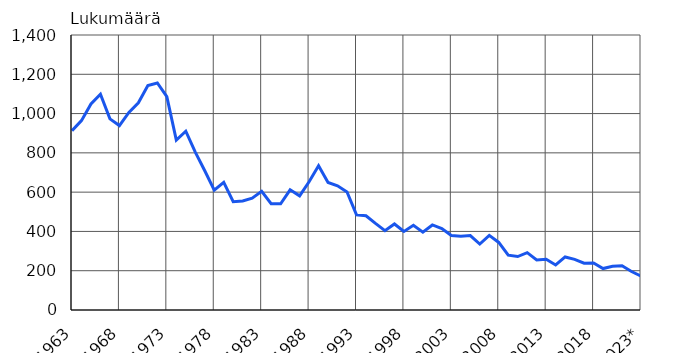
| Category | Tieliikenneonnettomuuksissa kuolleet |
|---|---|
| 1963 | 913 |
| 1964 | 964 |
| 1965 | 1049 |
| 1966 | 1098 |
| 1967 | 973 |
| 1968 | 939 |
| 1969 | 1006 |
| 1970 | 1055 |
| 1971 | 1143 |
| 1972 | 1156 |
| 1973 | 1086 |
| 1974 | 865 |
| 1975 | 910 |
| 1976 | 804 |
| 1977 | 709 |
| 1978 | 610 |
| 1979 | 650 |
| 1980 | 551 |
| 1981 | 555 |
| 1982 | 569 |
| 1983 | 604 |
| 1984 | 541 |
| 1985 | 541 |
| 1986 | 612 |
| 1987 | 581 |
| 1988 | 653 |
| 1989 | 734 |
| 1990 | 649 |
| 1991 | 632 |
| 1992 | 601 |
| 1993 | 484 |
| 1994 | 480 |
| 1995 | 441 |
| 1996 | 404 |
| 1997 | 438 |
| 1998 | 400 |
| 1999 | 431 |
| 2000 | 396 |
| 2001 | 433 |
| 2002 | 415 |
| 2003 | 379 |
| 2004 | 375 |
| 2005 | 379 |
| 2006 | 336 |
| 2007 | 380 |
| 2008 | 344 |
| 2009 | 279 |
| 2010 | 272 |
| 2011 | 292 |
| 2012 | 255 |
| 2013 | 258 |
| 2014 | 229 |
| 2015 | 270 |
| 2016 | 258 |
| 2017 | 238 |
| 2018 | 239 |
| 2019 | 211 |
| 2020 | 223 |
| 2021 | 225 |
| 2022 | 196 |
| 2023* | 173 |